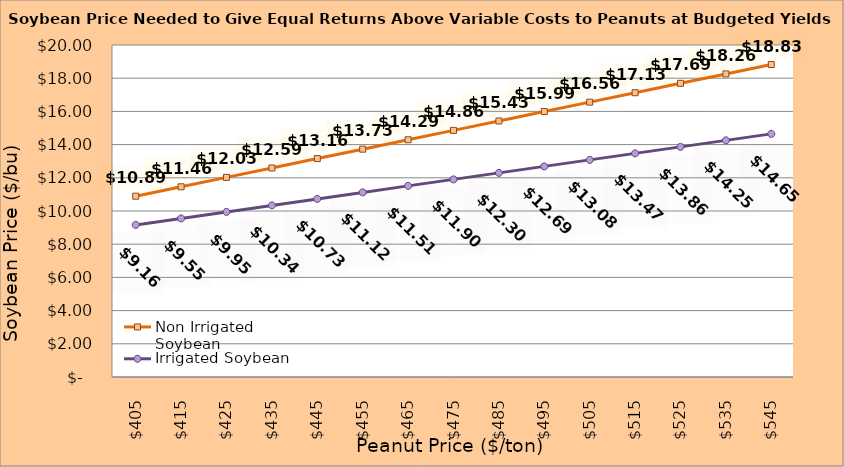
| Category | Non Irrigated Soybean | Irrigated Soybean |
|---|---|---|
| 405.0 | 10.892 | 9.163 |
| 415.0 | 11.458 | 9.554 |
| 425.0 | 12.025 | 9.946 |
| 435.0 | 12.592 | 10.338 |
| 445.0 | 13.158 | 10.729 |
| 455.0 | 13.725 | 11.121 |
| 465.0 | 14.292 | 11.513 |
| 475.0 | 14.858 | 11.904 |
| 485.0 | 15.425 | 12.296 |
| 495.0 | 15.992 | 12.688 |
| 505.0 | 16.558 | 13.079 |
| 515.0 | 17.125 | 13.471 |
| 525.0 | 17.692 | 13.863 |
| 535.0 | 18.258 | 14.254 |
| 545.0 | 18.825 | 14.646 |